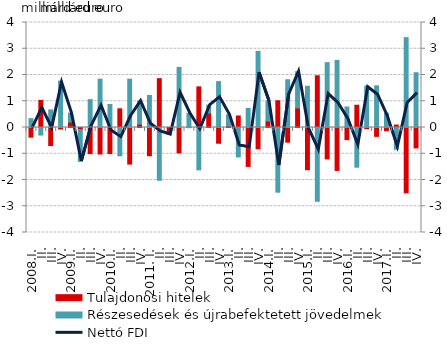
| Category | Tulajdonosi hitelek | Részesedések és újrabefektetett jövedelmek |
|---|---|---|
| 2008.I. | -0.368 | 0.337 |
| II. | 1.032 | -0.288 |
| III. | -0.686 | 0.671 |
| IV. | -0.057 | 1.77 |
| 2009.I. | 0.209 | 0.337 |
| II. | -0.079 | -1.212 |
| III. | -0.994 | 1.062 |
| IV. | -1.01 | 1.84 |
| 2010.I. | -0.992 | 0.877 |
| II. | 0.713 | -1.08 |
| III. | -1.394 | 1.841 |
| IV. | 0.13 | 0.876 |
| 2011. I. | -1.075 | 1.219 |
| II. | 1.86 | -2.011 |
| III. | -0.2 | -0.067 |
| IV. | -0.969 | 2.289 |
| 2012.I. | -0.004 | 0.539 |
| II. | 1.548 | -1.614 |
| III. | 0.552 | 0.3 |
| IV. | -0.6 | 1.748 |
| 2013.I. | 0.07 | 0.416 |
| II. | 0.439 | -1.121 |
| III. | -1.483 | 0.727 |
| IV. | -0.811 | 2.9 |
| 2014.I. | 0.246 | 0.762 |
| II. | 1.018 | -2.464 |
| III. | -0.558 | 1.818 |
| IV. | 0.746 | 1.38 |
| 2015.I. | -1.608 | 1.572 |
| II. | 1.971 | -2.812 |
| III. | -1.196 | 2.471 |
| IV. | -1.635 | 2.559 |
| 2016.I. | -0.463 | 0.782 |
| II. | 0.848 | -1.512 |
| III. | -0.041 | 1.576 |
| IV. | -0.337 | 1.587 |
| 2017.I. | -0.124 | 0.546 |
| II. | 0.093 | -0.829 |
| III. | -2.49 | 3.424 |
| IV. | -0.779 | 2.087 |